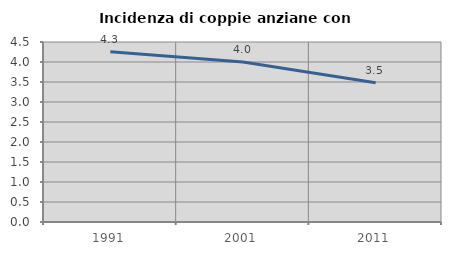
| Category | Incidenza di coppie anziane con figli |
|---|---|
| 1991.0 | 4.255 |
| 2001.0 | 4 |
| 2011.0 | 3.483 |